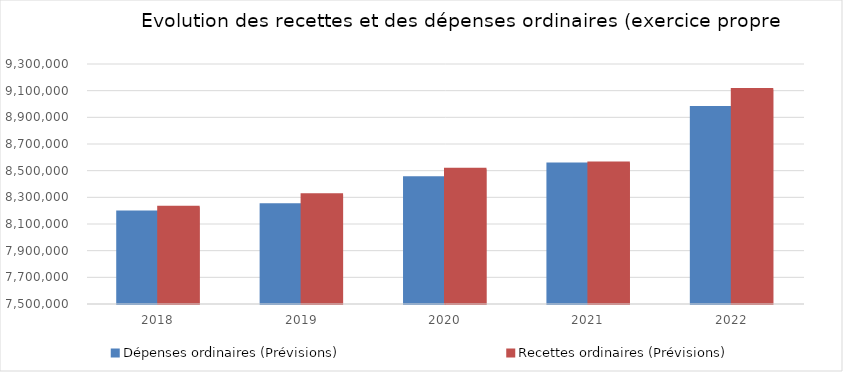
| Category | Dépenses ordinaires (Prévisions) | Recettes ordinaires (Prévisions) |
|---|---|---|
| 2018.0 | 8190380.24 | 8225067.75 |
| 2019.0 | 8244208.93 | 8319903.51 |
| 2020.0 | 8446462.59 | 8511024.74 |
| 2021.0 | 8550655.52 | 8556943.85 |
| 2022.0 | 8972906.51 | 9109237.94 |